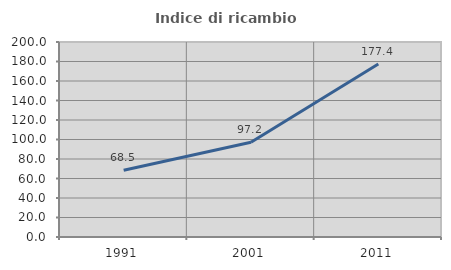
| Category | Indice di ricambio occupazionale  |
|---|---|
| 1991.0 | 68.48 |
| 2001.0 | 97.222 |
| 2011.0 | 177.403 |